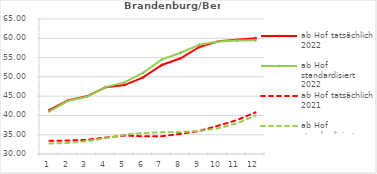
| Category | ab Hof tatsächlich 2022 | ab Hof standardisiert 2022 | ab Hof tatsächlich 2021 | ab Hof standardisiert 2021 |
|---|---|---|---|---|
| 0 | 41.36 | 41.025 | 33.401 | 32.707 |
| 1 | 43.957 | 43.803 | 33.497 | 32.863 |
| 2 | 44.954 | 44.821 | 33.681 | 33.343 |
| 3 | 47.309 | 47.351 | 34.26 | 34.067 |
| 4 | 47.866 | 48.568 | 34.772 | 35.003 |
| 5 | 49.872 | 51.026 | 34.593 | 35.446 |
| 6 | 53.084 | 54.496 | 34.61 | 35.613 |
| 7 | 54.815 | 56.246 | 35.216 | 35.721 |
| 8 | 57.746 | 58.328 | 35.989 | 35.945 |
| 9 | 59.204 | 59.153 | 37.333 | 36.667 |
| 10 | 59.608 | 59.397 | 38.78 | 37.931 |
| 11 | 60.03 | 59.479 | 40.797 | 39.964 |